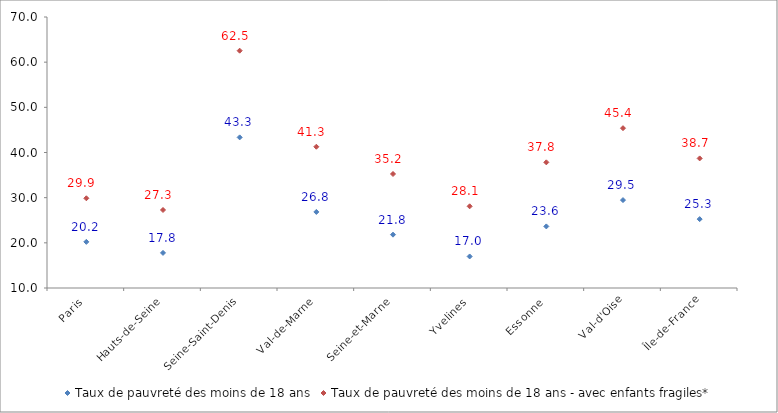
| Category | Taux de pauvreté des moins de 18 ans | Taux de pauvreté des moins de 18 ans - avec enfants fragiles* |
|---|---|---|
| Paris | 20.217 | 29.863 |
| Hauts-de-Seine | 17.772 | 27.273 |
| Seine-Saint-Denis | 43.348 | 62.545 |
| Val-de-Marne | 26.842 | 41.275 |
| Seine-et-Marne | 21.807 | 35.24 |
| Yvelines | 16.984 | 28.084 |
| Essonne | 23.635 | 37.822 |
| Val-d'Oise | 29.464 | 45.384 |
| Île-de-France | 25.251 | 38.69 |